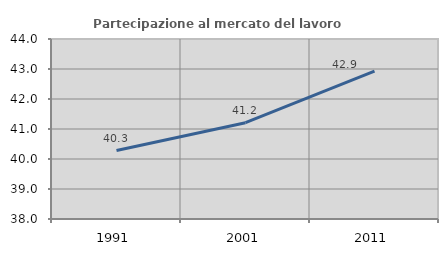
| Category | Partecipazione al mercato del lavoro  femminile |
|---|---|
| 1991.0 | 40.282 |
| 2001.0 | 41.211 |
| 2011.0 | 42.928 |